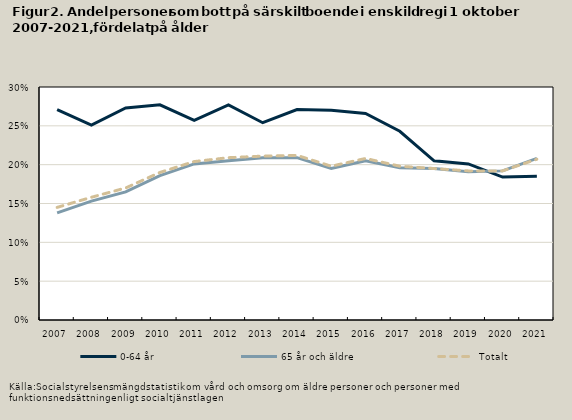
| Category | 0-64 år | 65 år och äldre | Totalt |
|---|---|---|---|
| 2007.0 | 0.271 | 0.138 | 0.145 |
| 2008.0 | 0.251 | 0.153 | 0.158 |
| 2009.0 | 0.273 | 0.165 | 0.17 |
| 2010.0 | 0.277 | 0.186 | 0.19 |
| 2011.0 | 0.257 | 0.201 | 0.204 |
| 2012.0 | 0.277 | 0.205 | 0.209 |
| 2013.0 | 0.254 | 0.209 | 0.211 |
| 2014.0 | 0.271 | 0.209 | 0.212 |
| 2015.0 | 0.27 | 0.195 | 0.198 |
| 2016.0 | 0.266 | 0.205 | 0.208 |
| 2017.0 | 0.243 | 0.196 | 0.198 |
| 2018.0 | 0.205 | 0.195 | 0.195 |
| 2019.0 | 0.201 | 0.191 | 0.192 |
| 2020.0 | 0.184 | 0.192 | 0.192 |
| 2021.0 | 0.185 | 0.208 | 0.207 |